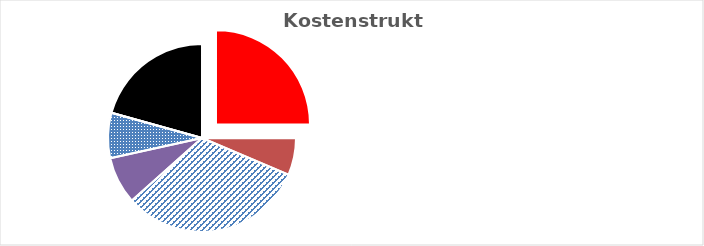
| Category | Series 0 |
|---|---|
| KV-Entgelt produktiv Tätige | 1 |
| Weitere Personalkosten produktiv | 0.253 |
| Personalnebenkosten | 1.278 |
| Unproduktives Personal | 0.325 |
| Deckung Personalgemeinkosten | 0.31 |
| Umlagen ohne GZ | 0 |
| Gesamtzuschlag | 0.825 |